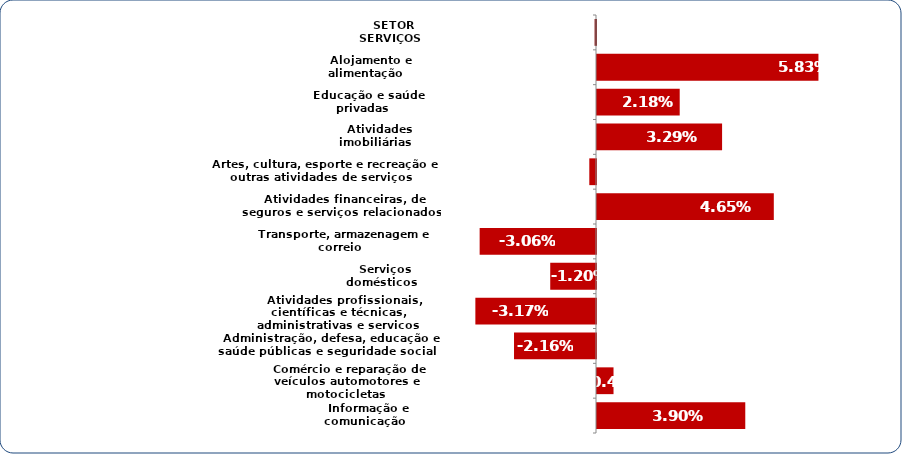
| Category | Series 0 |
|---|---|
|   Informação e comunicação | 0.039 |
|   Comércio e reparação de veículos automotores e motocicletas | 0.004 |
|   Administração, defesa, educação e saúde públicas e seguridade social | -0.022 |
|   Atividades profissionais, científicas e técnicas, administrativas e serviços complementares | -0.032 |
|   Serviços domésticos | -0.012 |
|   Transporte, armazenagem e correio | -0.031 |
|   Atividades financeiras, de seguros e serviços relacionados | 0.047 |
|   Artes, cultura, esporte e recreação e outras atividades de serviços | -0.002 |
|   Atividades imobiliárias | 0.033 |
|   Educação e saúde privadas | 0.022 |
|   Alojamento e alimentação | 0.058 |
|   SETOR SERVIÇOS | 0 |